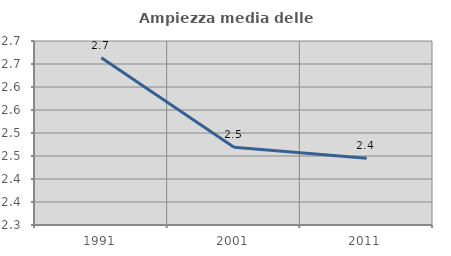
| Category | Ampiezza media delle famiglie |
|---|---|
| 1991.0 | 2.664 |
| 2001.0 | 2.469 |
| 2011.0 | 2.445 |